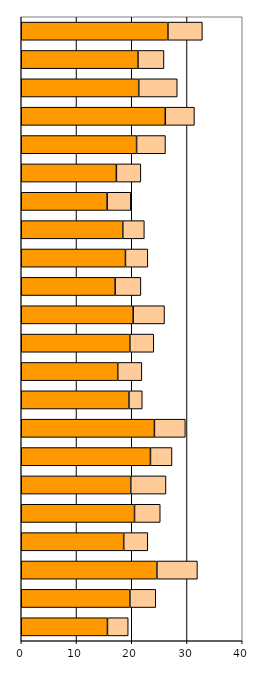
| Category | Series 0 | Series 1 |
|---|---|---|
| 0 | 15.602 | 3.758 |
| 1 | 19.667 | 4.683 |
| 2 | 24.548 | 7.339 |
| 3 | 18.543 | 4.363 |
| 4 | 20.501 | 4.655 |
| 5 | 19.822 | 6.371 |
| 6 | 23.385 | 3.898 |
| 7 | 24.106 | 5.599 |
| 8 | 19.488 | 2.416 |
| 9 | 17.463 | 4.366 |
| 10 | 19.653 | 4.334 |
| 11 | 20.259 | 5.672 |
| 12 | 16.995 | 4.66 |
| 13 | 18.861 | 4.049 |
| 14 | 18.376 | 3.902 |
| 15 | 15.547 | 4.285 |
| 16 | 17.216 | 4.43 |
| 17 | 20.879 | 5.22 |
| 18 | 26.072 | 5.27 |
| 19 | 21.267 | 6.968 |
| 20 | 21.123 | 4.706 |
| 21 | 26.544 | 6.237 |